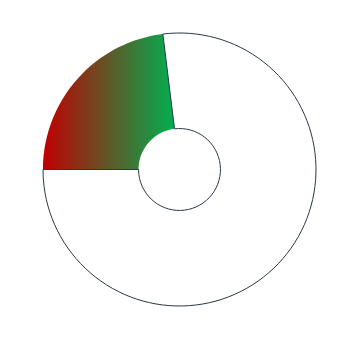
| Category | Series 0 |
|---|---|
| 0 | 83 |
| 1 | 277 |